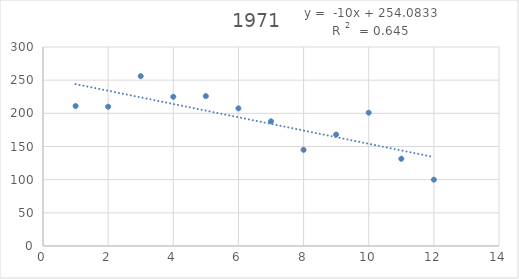
| Category | Median |
|---|---|
| 1.0 | 211 |
| 2.0 | 210 |
| 3.0 | 256 |
| 4.0 | 225 |
| 5.0 | 226 |
| 6.0 | 207.5 |
| 7.0 | 188 |
| 8.0 | 145 |
| 9.0 | 168 |
| 10.0 | 201 |
| 11.0 | 131.5 |
| 12.0 | 100 |